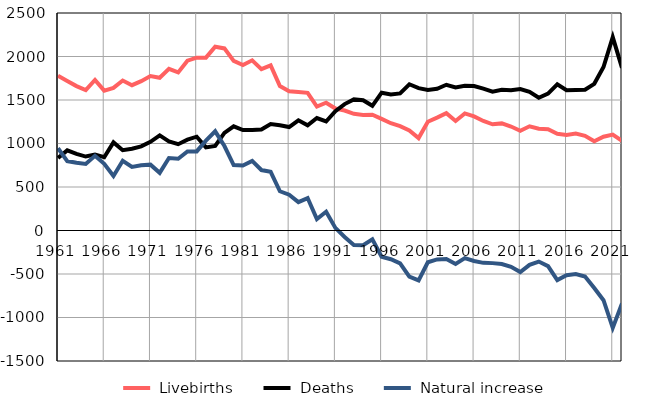
| Category |  Livebirths |  Deaths |  Natural increase |
|---|---|---|---|
| 1961.0 | 1779 | 833 | 946 |
| 1962.0 | 1719 | 921 | 798 |
| 1963.0 | 1660 | 881 | 779 |
| 1964.0 | 1615 | 850 | 765 |
| 1965.0 | 1731 | 873 | 858 |
| 1966.0 | 1608 | 842 | 766 |
| 1967.0 | 1639 | 1013 | 626 |
| 1968.0 | 1724 | 923 | 801 |
| 1969.0 | 1670 | 940 | 730 |
| 1970.0 | 1716 | 967 | 749 |
| 1971.0 | 1776 | 1019 | 757 |
| 1972.0 | 1756 | 1093 | 663 |
| 1973.0 | 1858 | 1025 | 833 |
| 1974.0 | 1817 | 992 | 825 |
| 1975.0 | 1952 | 1044 | 908 |
| 1976.0 | 1987 | 1078 | 909 |
| 1977.0 | 1987 | 955 | 1032 |
| 1978.0 | 2112 | 972 | 1140 |
| 1979.0 | 2093 | 1122 | 971 |
| 1980.0 | 1949 | 1197 | 752 |
| 1981.0 | 1902 | 1155 | 747 |
| 1982.0 | 1956 | 1156 | 800 |
| 1983.0 | 1855 | 1160 | 695 |
| 1984.0 | 1898 | 1223 | 675 |
| 1985.0 | 1661 | 1210 | 451 |
| 1986.0 | 1600 | 1189 | 411 |
| 1987.0 | 1593 | 1267 | 326 |
| 1988.0 | 1582 | 1209 | 373 |
| 1989.0 | 1424 | 1293 | 131 |
| 1990.0 | 1469 | 1253 | 216 |
| 1991.0 | 1402 | 1372 | 30 |
| 1992.0 | 1379 | 1453 | -74 |
| 1993.0 | 1341 | 1507 | -166 |
| 1994.0 | 1329 | 1498 | -169 |
| 1995.0 | 1331 | 1433 | -102 |
| 1996.0 | 1283 | 1584 | -301 |
| 1997.0 | 1233 | 1563 | -330 |
| 1998.0 | 1199 | 1576 | -377 |
| 1999.0 | 1150 | 1681 | -531 |
| 2000.0 | 1062 | 1636 | -574 |
| 2001.0 | 1250 | 1615 | -365 |
| 2002.0 | 1297 | 1629 | -332 |
| 2003.0 | 1348 | 1675 | -327 |
| 2004.0 | 1259 | 1644 | -385 |
| 2005.0 | 1346 | 1663 | -317 |
| 2006.0 | 1311 | 1661 | -350 |
| 2007.0 | 1259 | 1631 | -372 |
| 2008.0 | 1221 | 1596 | -375 |
| 2009.0 | 1231 | 1617 | -386 |
| 2010.0 | 1195 | 1612 | -417 |
| 2011.0 | 1147 | 1625 | -478 |
| 2012.0 | 1198 | 1593 | -395 |
| 2013.0 | 1169 | 1526 | -357 |
| 2014.0 | 1163 | 1573 | -410 |
| 2015.0 | 1111 | 1681 | -570 |
| 2016.0 | 1099 | 1613 | -514 |
| 2017.0 | 1115 | 1616 | -501 |
| 2018.0 | 1089 | 1618 | -529 |
| 2019.0 | 1025 | 1686 | -661 |
| 2020.0 | 1078 | 1879 | -801 |
| 2021.0 | 1103 | 2222 | -1119 |
| 2022.0 | 1032 | 1870 | -838 |